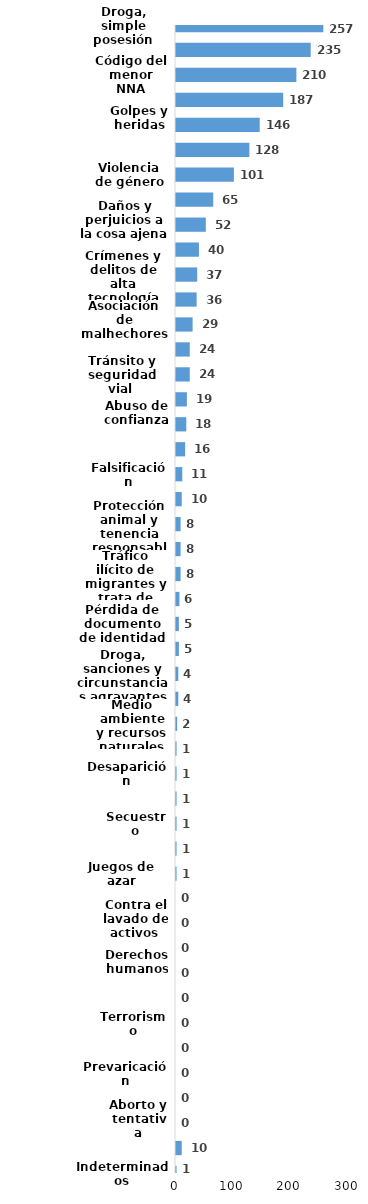
| Category | Series 0 |
|---|---|
| Droga, simple posesión | 257 |
| Robo calificado | 235 |
| Código del menor NNA | 210 |
| Violencia intrafamiliar | 187 |
| Golpes y heridas | 146 |
| Amenaza | 128 |
| Violencia de género | 101 |
| Ley de armas | 65 |
| Daños y perjuicios a la cosa ajena | 52 |
| Droga, distribución de droga | 40 |
| Crímenes y delitos de alta tecnología | 37 |
| Droga, traficante de droga | 36 |
| Asociación de malhechores | 29 |
| Código de trabajo | 24 |
| Tránsito y seguridad vial  | 24 |
| Estafa | 19 |
| Abuso de confianza | 18 |
| Agresión sexual | 16 |
| Falsificación | 11 |
| Violación sexual | 10 |
| Protección animal y tenencia responsable | 8 |
| Crímenes y delitos contra la propiedad | 8 |
| Tráfico ilícito de migrantes y trata de personas | 8 |
| Homicidio | 6 |
| Pérdida de documento de identidad | 5 |
| Robo simple | 5 |
| Droga, sanciones y circunstancias agravantes | 4 |
| Difamación e injuria | 4 |
| Medio ambiente y recursos naturales | 2 |
| Tentativa de homicidio | 1 |
| Desaparición | 1 |
| Propiedad industrial, intelectual y derecho de autor | 1 |
| Secuestro | 1 |
| Ley general de salud | 1 |
| Juegos de azar | 1 |
| Conflictos sociales | 0 |
| Contra el lavado de activos  | 0 |
| Ley de cheques | 0 |
| Derechos humanos | 0 |
| Proxenetismo | 0 |
| Terrorismo | 0 |
| Soborno | 0 |
| Prevaricación | 0 |
| Droga, delitos y sanciones | 0 |
| Aborto y tentativa | 0 |
| Otros | 10 |
| Indeterminados | 1 |